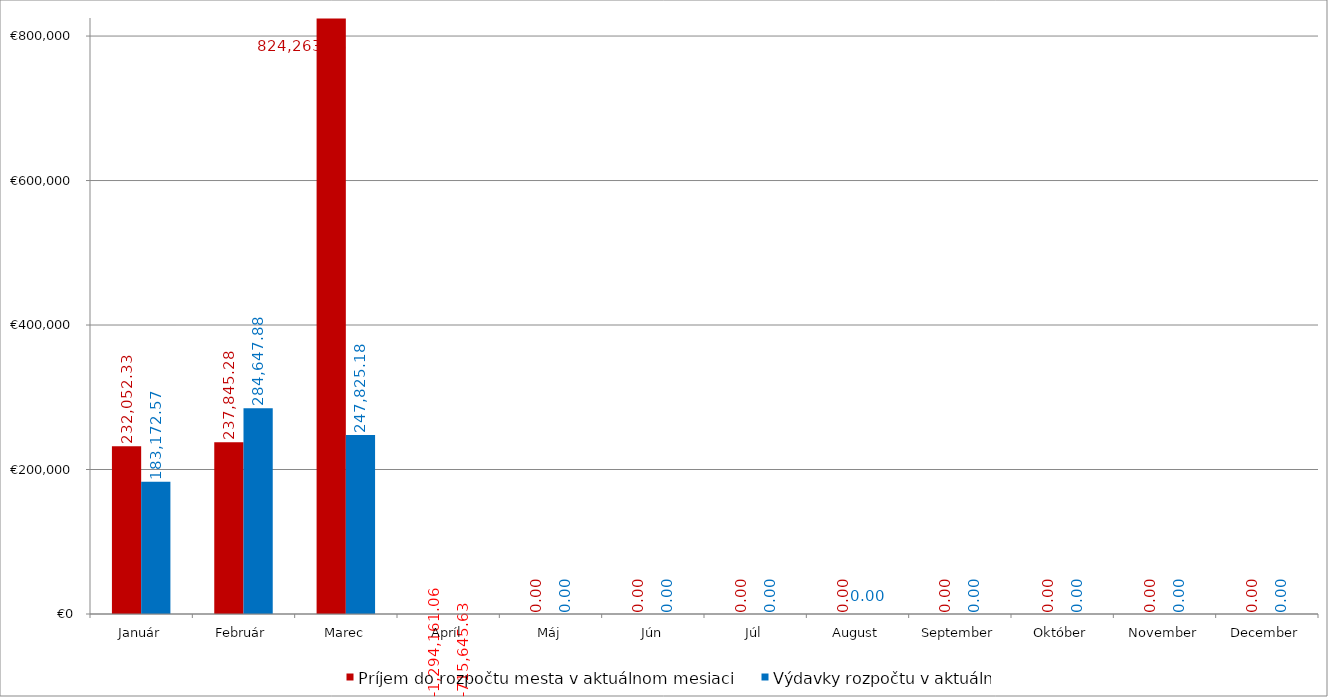
| Category | Príjem do rozpočtu mesta v aktuálnom mesiaci | Výdavky rozpočtu v aktuálnom  mesiaci |
|---|---|---|
| Január | 232052.33 | 183172.57 |
| Február | 237845.28 | 284647.88 |
| Marec | 824263.45 | 247825.18 |
| Apríl | -1294161.06 | -715645.63 |
| Máj | 0 | 0 |
| Jún | 0 | 0 |
| Júl | 0 | 0 |
| August | 0 | 0 |
| September | 0 | 0 |
| Október | 0 | 0 |
| November | 0 | 0 |
| December | 0 | 0 |